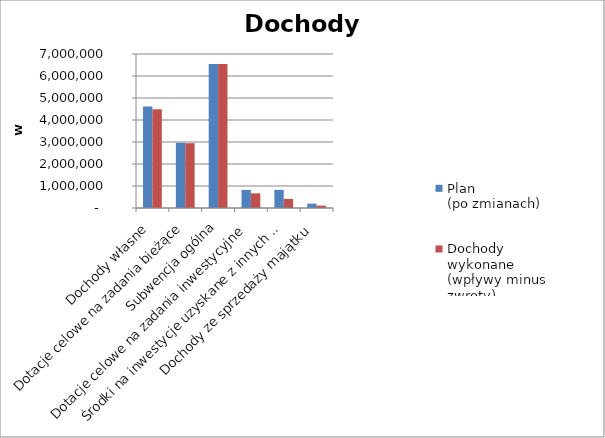
| Category | Plan 
(po zmianach) | Dochody 
wykonane
(wpływy minus zwroty) |
|---|---|---|
| Dochody własne | 4610558.47 | 4486357.09 |
| Dotacje celowe na zadania bieżące | 2962551.56 | 2945942.2 |
| Subwencja ogólna | 6549388 | 6549388 |
| Dotacje celowe na zadania inwestycyjne | 822154 | 666000 |
| Środki na inwestycje uzyskane z innych źródeł | 824514.43 | 412850.45 |
| Dochody ze sprzedaży majątku | 197000 | 108959.2 |